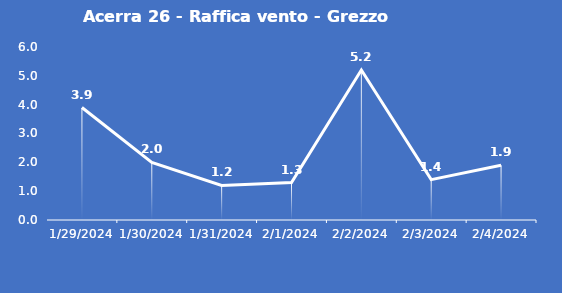
| Category | Acerra 26 - Raffica vento - Grezzo (m/s) |
|---|---|
| 1/29/24 | 3.9 |
| 1/30/24 | 2 |
| 1/31/24 | 1.2 |
| 2/1/24 | 1.3 |
| 2/2/24 | 5.2 |
| 2/3/24 | 1.4 |
| 2/4/24 | 1.9 |